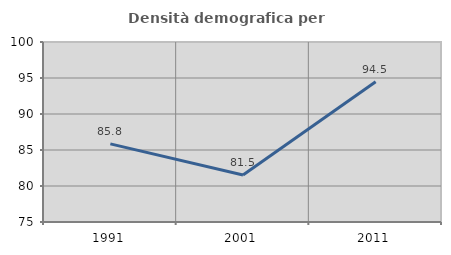
| Category | Densità demografica |
|---|---|
| 1991.0 | 85.846 |
| 2001.0 | 81.53 |
| 2011.0 | 94.478 |